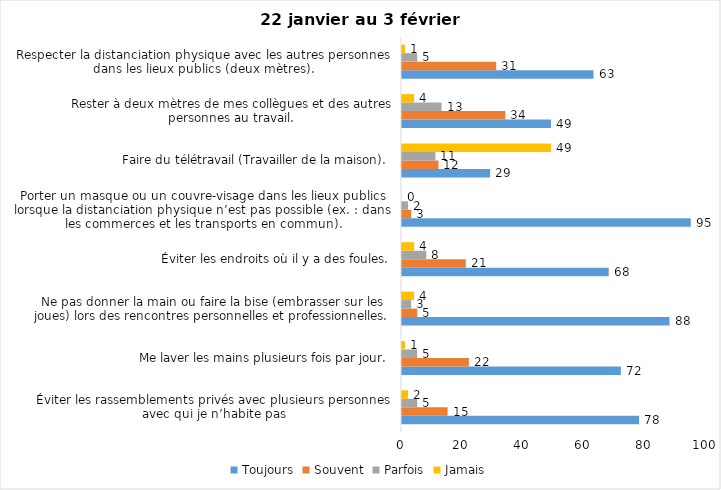
| Category | Toujours | Souvent | Parfois | Jamais |
|---|---|---|---|---|
| Éviter les rassemblements privés avec plusieurs personnes avec qui je n’habite pas | 78 | 15 | 5 | 2 |
| Me laver les mains plusieurs fois par jour. | 72 | 22 | 5 | 1 |
| Ne pas donner la main ou faire la bise (embrasser sur les joues) lors des rencontres personnelles et professionnelles. | 88 | 5 | 3 | 4 |
| Éviter les endroits où il y a des foules. | 68 | 21 | 8 | 4 |
| Porter un masque ou un couvre-visage dans les lieux publics lorsque la distanciation physique n’est pas possible (ex. : dans les commerces et les transports en commun). | 95 | 3 | 2 | 0 |
| Faire du télétravail (Travailler de la maison). | 29 | 12 | 11 | 49 |
| Rester à deux mètres de mes collègues et des autres personnes au travail. | 49 | 34 | 13 | 4 |
| Respecter la distanciation physique avec les autres personnes dans les lieux publics (deux mètres). | 63 | 31 | 5 | 1 |